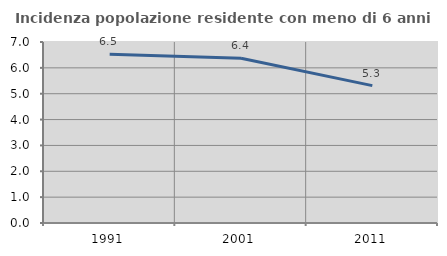
| Category | Incidenza popolazione residente con meno di 6 anni |
|---|---|
| 1991.0 | 6.528 |
| 2001.0 | 6.372 |
| 2011.0 | 5.314 |